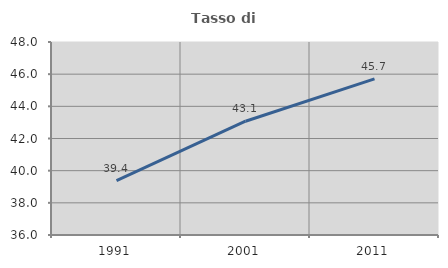
| Category | Tasso di occupazione   |
|---|---|
| 1991.0 | 39.376 |
| 2001.0 | 43.074 |
| 2011.0 | 45.708 |